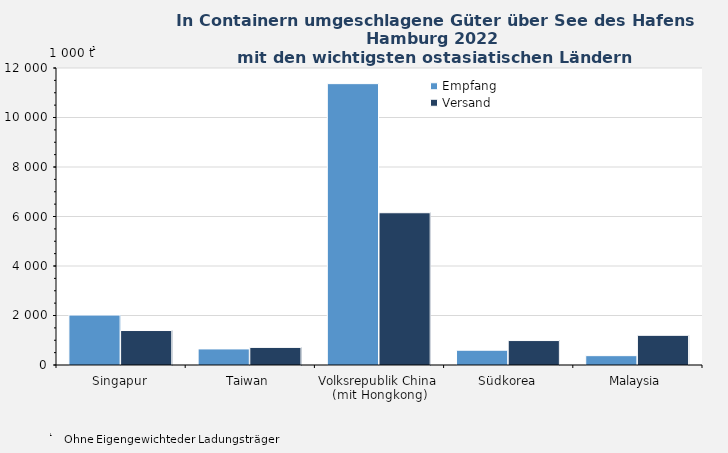
| Category | Empfang | Versand |
|---|---|---|
| Singapur | 2018 | 1393 |
| Taiwan | 649 | 712 |
| Volksrepublik China 
(mit Hongkong) | 11368 | 6152 |
| Südkorea | 597 | 988 |
| Malaysia | 377 | 1199 |